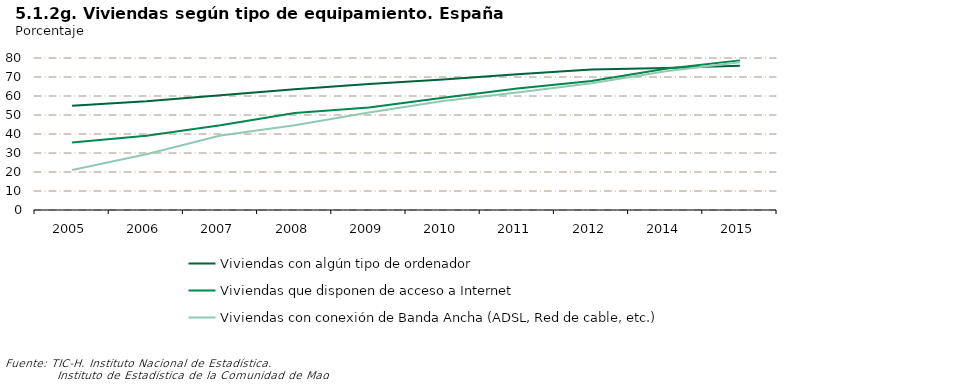
| Category | Viviendas con algún tipo de ordenador | Viviendas que disponen de acceso a Internet | Viviendas con conexión de Banda Ancha (ADSL, Red de cable, etc.) |
|---|---|---|---|
| 2005.0 | 54.9 | 35.5 | 21.1 |
| 2006.0 | 57.2 | 39.1 | 29.3 |
| 2007.0 | 60.4 | 44.6 | 39.2 |
| 2008.0 | 63.6 | 51 | 44.6 |
| 2009.0 | 66.3 | 54 | 51.3 |
| 2010.0 | 68.7 | 59.1 | 57.4 |
| 2011.0 | 71.5 | 63.9 | 61.9 |
| 2012.0 | 73.915 | 67.867 | 66.732 |
| 2014.0 | 74.778 | 74.355 | 73.015 |
| 2015.0 | 75.865 | 78.749 | 77.821 |